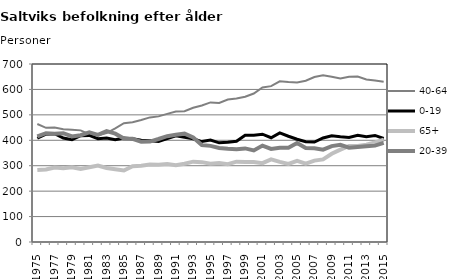
| Category | 40-64 | 0-19 | 65+ | 20-39 |
|---|---|---|---|---|
| 1975.0 | 464 | 408 | 283 | 415 |
| 1976.0 | 449 | 424 | 285 | 428 |
| 1977.0 | 450 | 426 | 293 | 426 |
| 1978.0 | 443 | 409 | 290 | 428 |
| 1979.0 | 441 | 402 | 294 | 415 |
| 1980.0 | 439 | 418 | 287 | 420 |
| 1981.0 | 424 | 419 | 294 | 431 |
| 1982.0 | 420 | 406 | 301 | 421 |
| 1983.0 | 428 | 409 | 291 | 436 |
| 1984.0 | 447 | 402 | 286 | 426 |
| 1985.0 | 467 | 409 | 281 | 407 |
| 1986.0 | 471 | 406 | 298 | 406 |
| 1987.0 | 480 | 400 | 300 | 394 |
| 1988.0 | 490 | 398 | 305 | 395 |
| 1989.0 | 494 | 395 | 304 | 405 |
| 1990.0 | 504 | 407 | 307 | 416 |
| 1991.0 | 513 | 418 | 302 | 422 |
| 1992.0 | 514 | 412 | 308 | 426 |
| 1993.0 | 528 | 406 | 316 | 411 |
| 1994.0 | 537 | 395 | 314 | 381 |
| 1995.0 | 549 | 401 | 308 | 378 |
| 1996.0 | 547 | 390 | 311 | 370 |
| 1997.0 | 560 | 392 | 306 | 367 |
| 1998.0 | 564 | 396 | 316 | 365 |
| 1999.0 | 571 | 420 | 315 | 368 |
| 2000.0 | 584 | 420 | 315 | 360 |
| 2001.0 | 608 | 424 | 310 | 379 |
| 2002.0 | 613 | 410 | 325 | 366 |
| 2003.0 | 632 | 429 | 315 | 371 |
| 2004.0 | 629 | 416 | 307 | 371 |
| 2005.0 | 627 | 404 | 319 | 389 |
| 2006.0 | 634 | 394 | 308 | 370 |
| 2007.0 | 649 | 393 | 320 | 369 |
| 2008.0 | 656 | 409 | 325 | 363 |
| 2009.0 | 650 | 418 | 347 | 377 |
| 2010.0 | 643 | 414 | 363 | 382 |
| 2011.0 | 650 | 411 | 378 | 371 |
| 2012.0 | 651 | 420 | 378 | 374 |
| 2013.0 | 639 | 414 | 383 | 377 |
| 2014.0 | 635 | 419 | 392 | 379 |
| 2015.0 | 630 | 407 | 402 | 390 |